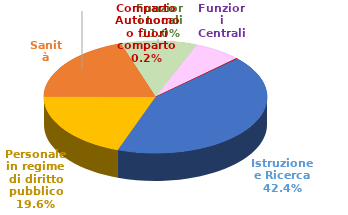
| Category | Series 0 |
|---|---|
| Istruzione e Ricerca | 29950 |
| Personale in regime di diritto pubblico | 13853 |
| Sanità | 14017 |
| Funzioni Locali | 7779 |
| Funzioni Centrali | 4868 |
| Comparto Autonomo o fuori comparto | 141 |